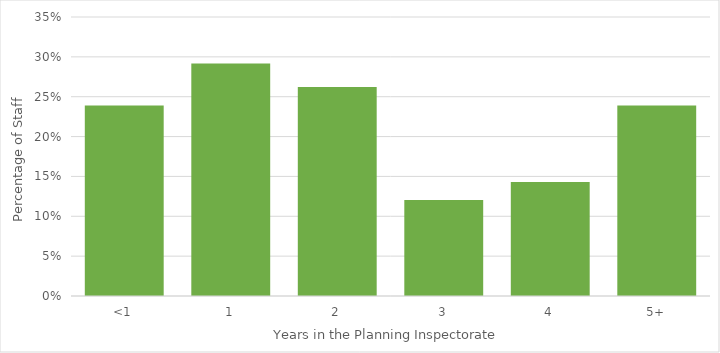
| Category | % of Total |
|---|---|
| <1 | 0.239 |
| 1 | 0.292 |
| 2 | 0.262 |
| 3 | 0.12 |
| 4 | 0.143 |
| 5+ | 0.239 |